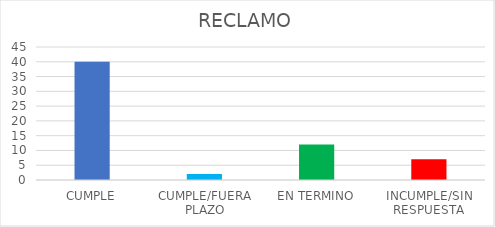
| Category | Series 0 |
|---|---|
| CUMPLE | 40 |
| CUMPLE/FUERA PLAZO | 2 |
| EN TERMINO | 12 |
| INCUMPLE/SIN RESPUESTA | 7 |